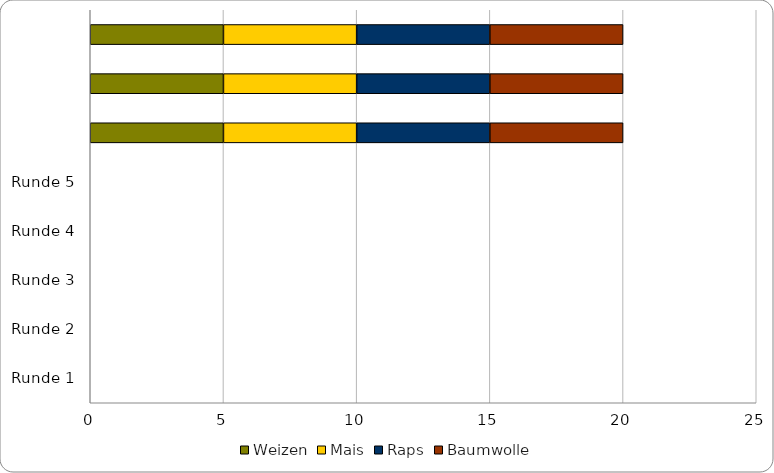
| Category | Weizen | Mais | Raps | Baumwolle |
|---|---|---|---|---|
|  | 5 | 5 | 5 | 5 |
|  | 5 | 5 | 5 | 5 |
|  | 5 | 5 | 5 | 5 |
| Runde 5 | 0 | 0 | 0 | 0 |
| Runde 4 | 0 | 0 | 0 | 0 |
| Runde 3 | 0 | 0 | 0 | 0 |
| Runde 2 | 0 | 0 | 0 | 0 |
| Runde 1 | 0 | 0 | 0 | 0 |